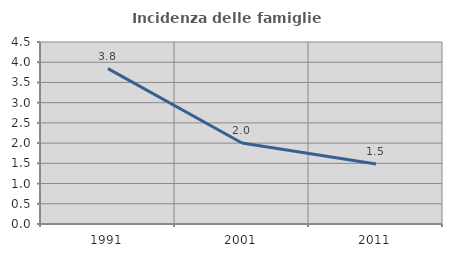
| Category | Incidenza delle famiglie numerose |
|---|---|
| 1991.0 | 3.842 |
| 2001.0 | 2.002 |
| 2011.0 | 1.481 |